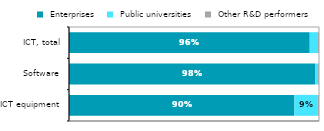
| Category |  Enterprises |  Public universities |  Other R&D performers |
|---|---|---|---|
| ICT equipment | 0.902 | 0.092 | 0.007 |
| Software | 0.984 | 0.012 | 0.003 |
| ICT, total | 0.963 | 0.033 | 0.004 |